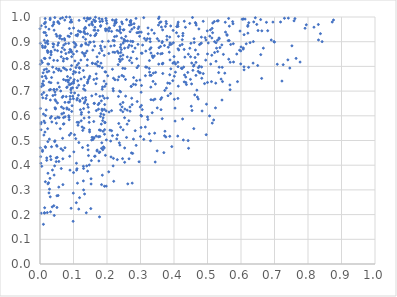
| Category | Series 0 |
|---|---|
| 0.10026556874731984 | 0.955 |
| 0.1819517743575303 | 0.609 |
| 0.1771262258294951 | 0.543 |
| 0.09390472384689774 | 0.86 |
| 0.16819413947047313 | 0.621 |
| 0.13568587887254713 | 0.955 |
| 0.20646389349107408 | 0.956 |
| 0.24066927445548747 | 0.554 |
| 0.015350063579710693 | 0.994 |
| 0.08437810121484224 | 0.736 |
| 0.09265286069839018 | 0.933 |
| 0.19814666030538775 | 0.985 |
| 0.1728333258345255 | 0.801 |
| 0.05060962885397868 | 0.229 |
| 0.08146551670438285 | 0.831 |
| 0.31585741547664603 | 0.862 |
| 0.5141808002395327 | 0.57 |
| 0.13102281671250027 | 0.938 |
| 0.607249656115732 | 0.992 |
| 0.27245043924423096 | 0.72 |
| 0.4761787506499745 | 0.774 |
| 0.13205579944221146 | 0.995 |
| 0.09480927989038723 | 0.731 |
| 0.19284473497875354 | 0.544 |
| 0.03145826905657623 | 0.211 |
| 0.2684906771497301 | 0.636 |
| 0.0689478089544322 | 0.679 |
| 0.11557802902882763 | 0.573 |
| 0.058682614736407346 | 0.914 |
| 0.0326091016070601 | 0.734 |
| 0.5750534551063965 | 0.981 |
| 0.1812025637016521 | 0.965 |
| 0.37188098921376656 | 0.519 |
| 0.13011481149460147 | 0.3 |
| 0.09579205669434854 | 0.641 |
| 0.5630582075837851 | 0.994 |
| 0.14620104510435572 | 0.992 |
| 6.409337085722111e-05 | 0.952 |
| 0.34501975401663887 | 0.776 |
| 0.5895707883860501 | 0.738 |
| 0.2841366990871361 | 0.54 |
| 0.1932207194245642 | 0.645 |
| 0.49557039403925884 | 0.907 |
| 0.18203469431865327 | 0.813 |
| 0.29907158180951077 | 0.635 |
| 0.014689962870337192 | 0.974 |
| 0.01535874526490244 | 0.832 |
| 0.1416819617440359 | 0.996 |
| 0.3027980588597663 | 0.642 |
| 0.4000415185988617 | 0.84 |
| 0.1638745704379666 | 0.946 |
| 0.21792696517527554 | 0.858 |
| 0.4494439416527911 | 0.839 |
| 0.3231766760107959 | 0.932 |
| 0.12060226647865258 | 0.625 |
| 0.027974936177323828 | 0.506 |
| 0.4314428765722057 | 0.765 |
| 0.20520382773491652 | 0.944 |
| 0.08138927686604114 | 0.744 |
| 0.046264569549891665 | 0.629 |
| 0.1765838042286566 | 0.994 |
| 0.01572348346076824 | 0.881 |
| 0.1961381049480757 | 0.945 |
| 0.4757139089389447 | 0.801 |
| 0.47430758918889815 | 0.952 |
| 0.4837980612194973 | 0.619 |
| 0.0026400657989910092 | 0.567 |
| 0.6797208627374799 | 0.945 |
| 0.5447931910867474 | 0.739 |
| 0.22728178959850187 | 0.989 |
| 0.6226952449082305 | 0.796 |
| 0.290195240685844 | 0.658 |
| 0.050525854703393436 | 0.922 |
| 0.5088011995242288 | 0.948 |
| 0.529937931306942 | 0.906 |
| 0.6427790357765258 | 0.997 |
| 0.25076080657347033 | 0.903 |
| 0.3025956680277393 | 0.854 |
| 0.6206462300745111 | 0.935 |
| 0.13402399781159857 | 0.656 |
| 0.028405896199059533 | 0.303 |
| 0.18062035601702253 | 0.883 |
| 0.15087369128088557 | 0.925 |
| 0.525501412248981 | 0.821 |
| 0.04834173558590216 | 0.43 |
| 0.02363641802173022 | 0.324 |
| 0.32195987168261453 | 0.585 |
| 0.2972922508358854 | 0.922 |
| 0.34970245159382785 | 0.458 |
| 0.27313207275730034 | 0.97 |
| 0.11806937995396949 | 0.268 |
| 0.3032494422821824 | 0.599 |
| 0.06963267569592202 | 0.822 |
| 0.6232424346209404 | 0.977 |
| 0.011935296388305039 | 0.579 |
| 0.061790431292910175 | 0.7 |
| 0.30112448925025115 | 0.602 |
| 0.16078771010480375 | 0.747 |
| 0.39744304814601106 | 0.946 |
| 0.5777168464549666 | 0.818 |
| 0.09294808445555347 | 0.988 |
| 0.1857196758212537 | 0.707 |
| 0.6470615556043265 | 0.97 |
| 0.05630012212312174 | 0.415 |
| 0.5118689039386773 | 0.738 |
| 0.46570169630899616 | 0.816 |
| 0.09090278505324034 | 0.788 |
| 0.24771757181139464 | 0.654 |
| 0.4527575087007224 | 0.814 |
| 0.05721925283836182 | 0.592 |
| 0.21934226022339232 | 0.752 |
| 0.6621734675893267 | 0.944 |
| 0.21368206760084119 | 0.942 |
| 0.25256290688585736 | 0.874 |
| 0.026783047678916705 | 0.951 |
| 0.7222401149916392 | 0.741 |
| 0.28075889666424114 | 0.973 |
| 0.33844782966370923 | 0.664 |
| 0.10392139179354021 | 0.878 |
| 0.4289293820875515 | 0.797 |
| 0.05230524627519173 | 0.864 |
| 0.09996996792522272 | 0.739 |
| 0.2559468799506681 | 0.922 |
| 0.16527526789529368 | 0.983 |
| 0.3263272542150569 | 0.528 |
| 0.2041702188227953 | 0.902 |
| 0.0507978492324479 | 0.477 |
| 0.5022482805342792 | 0.895 |
| 0.28706572583440726 | 0.48 |
| 0.3873801746113543 | 0.517 |
| 0.2663928652031412 | 0.886 |
| 0.661622896695709 | 0.751 |
| 0.010205455347492842 | 0.161 |
| 0.07030479660082845 | 0.747 |
| 0.23336439731173997 | 0.807 |
| 0.09272186306708186 | 0.982 |
| 0.10049003727784211 | 0.732 |
| 0.4790044537882422 | 0.892 |
| 0.28543485180994976 | 0.726 |
| 0.07832382068665056 | 0.678 |
| 0.10207341336619036 | 0.746 |
| 0.19215394253312934 | 0.626 |
| 0.42638629053642363 | 0.924 |
| 0.3548192222549754 | 0.904 |
| 0.09463059476489477 | 0.839 |
| 0.3349152714985585 | 0.612 |
| 0.3374752089544185 | 0.739 |
| 0.3384285799936705 | 0.773 |
| 0.10673999795277944 | 0.507 |
| 0.4125450617346582 | 0.979 |
| 0.5584927640739896 | 0.926 |
| 0.7296597914485607 | 0.995 |
| 0.6089242858925805 | 0.798 |
| 0.14045152138158867 | 0.862 |
| 0.6067408262787598 | 0.87 |
| 0.21360305617156394 | 0.621 |
| 0.06729628260377996 | 0.997 |
| 0.1786051730309648 | 0.679 |
| 0.6201764976616749 | 0.962 |
| 0.12134941940192745 | 0.94 |
| 0.1156605837023541 | 0.222 |
| 0.4371444842653355 | 0.726 |
| 0.041335983334457316 | 0.236 |
| 0.07457308683811725 | 0.654 |
| 0.0010905449936980949 | 0.893 |
| 0.4491313030098565 | 0.747 |
| 0.35001248794377404 | 0.632 |
| 0.1415229263325679 | 0.732 |
| 0.24074856537766642 | 0.623 |
| 0.5152808632112897 | 0.936 |
| 0.1638888438110856 | 0.958 |
| 0.4600235423387037 | 0.912 |
| 0.15461581681760728 | 0.681 |
| 0.12427719698328255 | 0.887 |
| 0.5957575849191697 | 0.866 |
| 0.2496666833154575 | 0.759 |
| 0.2089294490249608 | 0.542 |
| 0.3648366425011349 | 0.588 |
| 0.21091629650734067 | 0.498 |
| 0.044230331052747096 | 0.998 |
| 0.20770131290302307 | 0.954 |
| 0.05776216552282676 | 0.716 |
| 0.0281160524121421 | 0.704 |
| 0.06369094943995224 | 0.858 |
| 0.08706075912773859 | 0.584 |
| 0.0256980213396949 | 0.329 |
| 0.3881559062207369 | 0.826 |
| 0.006911389719848504 | 0.816 |
| 0.2766580065197035 | 0.448 |
| 0.08878684861618269 | 0.999 |
| 0.01601963362349057 | 0.333 |
| 0.3828430549997136 | 0.877 |
| 0.12906488099740143 | 0.919 |
| 0.37243811150176453 | 0.703 |
| 0.523831074597965 | 0.632 |
| 0.2311463020378831 | 0.522 |
| 0.16766662326689152 | 0.77 |
| 0.1347222853658233 | 0.704 |
| 0.07064562896821935 | 0.611 |
| 0.28872818774900155 | 0.831 |
| 0.11041341680096539 | 0.386 |
| 0.22451048598313272 | 0.981 |
| 0.012808798477404792 | 0.833 |
| 0.6585619603932726 | 0.99 |
| 0.4267459063185237 | 0.934 |
| 0.08644853887426607 | 0.857 |
| 0.02255690195745297 | 0.903 |
| 0.013933089729192605 | 0.228 |
| 0.18371177561457197 | 0.468 |
| 0.1635604016422022 | 0.924 |
| 0.05312627523438218 | 0.886 |
| 0.10729004170844492 | 0.795 |
| 0.0893396059844942 | 0.868 |
| 0.18847651014459477 | 0.592 |
| 0.11341998619497506 | 0.562 |
| 0.14282642441703552 | 0.48 |
| 0.17361154380483812 | 0.645 |
| 0.6271243233045264 | 0.896 |
| 0.19520417378286947 | 0.952 |
| 0.20518963799470902 | 0.373 |
| 0.4304789870395669 | 0.737 |
| 0.4999624870271625 | 0.85 |
| 0.3632060848736455 | 0.673 |
| 0.5578901570495735 | 0.929 |
| 0.6091595764979715 | 0.786 |
| 0.13950041197395335 | 0.397 |
| 0.24587155516521053 | 0.83 |
| 0.3873502810458115 | 0.919 |
| 0.5677325482540772 | 0.817 |
| 0.28929314846920295 | 0.936 |
| 0.3775293274903747 | 0.973 |
| 0.10877075779709156 | 0.408 |
| 0.11085850025772104 | 0.574 |
| 0.3552846711124541 | 0.876 |
| 0.08792464031030767 | 0.656 |
| 0.05417419624942865 | 0.277 |
| 0.49117990856359295 | 0.73 |
| 0.06045796507382517 | 0.548 |
| 0.16546098728261016 | 0.999 |
| 0.18937452700982738 | 0.474 |
| 0.4817669379369758 | 0.894 |
| 0.0030415355560901025 | 0.543 |
| 0.3205714733555646 | 0.912 |
| 0.40320620665382223 | 0.579 |
| 0.41419460996255697 | 0.866 |
| 0.0568124561529173 | 0.79 |
| 0.2739041135364201 | 0.883 |
| 0.3144355738101332 | 0.554 |
| 0.16699765742320927 | 0.687 |
| 0.1407786772447679 | 0.804 |
| 0.4244312361083943 | 0.889 |
| 0.24586819342463329 | 0.973 |
| 0.17715818919875526 | 0.853 |
| 0.020024968884303274 | 0.43 |
| 0.05022348571667945 | 0.707 |
| 0.11911961423895612 | 0.658 |
| 0.15550677330164198 | 0.513 |
| 0.8760285445301988 | 0.988 |
| 0.08677636847087322 | 0.625 |
| 0.04898208306755891 | 0.57 |
| 0.32919747569699487 | 0.9 |
| 0.011270269105640218 | 0.694 |
| 0.430351267950267 | 0.869 |
| 0.5674644719581031 | 0.706 |
| 0.031539858165400614 | 0.707 |
| 0.6368359996547834 | 0.9 |
| 0.07932324427630366 | 0.786 |
| 0.3016598181804785 | 0.553 |
| 0.07728244048470534 | 0.852 |
| 0.02119911983090339 | 0.777 |
| 0.22859007836038947 | 0.922 |
| 0.3422933845242234 | 0.53 |
| 0.597123470158712 | 0.943 |
| 0.41164776417916316 | 0.67 |
| 0.4599835990900918 | 0.806 |
| 0.07498233480556238 | 0.596 |
| 0.24043880692611552 | 0.841 |
| 0.3261755597148862 | 0.792 |
| 0.31872790273285867 | 0.797 |
| 0.031194139379450703 | 0.435 |
| 0.3880297455714433 | 0.895 |
| 0.3714815866897311 | 0.885 |
| 0.09093082733129654 | 0.728 |
| 0.11672121599017438 | 0.986 |
| 0.06545400941026491 | 0.91 |
| 0.11460371003813241 | 0.683 |
| 0.16794064615978355 | 0.933 |
| 0.23426854064865532 | 0.678 |
| 0.06836639866201366 | 0.46 |
| 0.2657998654338719 | 0.426 |
| 0.04754513193280607 | 0.659 |
| 0.292474212310208 | 0.937 |
| 0.17325080123220804 | 0.946 |
| 0.16328725709011604 | 0.882 |
| 0.2533458427211954 | 0.627 |
| 0.09203194989920005 | 0.705 |
| 0.7610190131869656 | 0.994 |
| 0.26015244175007557 | 0.566 |
| 0.46548607563532096 | 0.764 |
| 0.14859013473089977 | 0.76 |
| 0.10840537643241077 | 0.248 |
| 0.12195217345697362 | 0.826 |
| 0.3312097103470423 | 0.854 |
| 0.034034378509233854 | 0.597 |
| 0.4828982078259286 | 0.752 |
| 0.02012501586576676 | 0.682 |
| 0.04215014274249995 | 0.36 |
| 0.023308686726032923 | 0.81 |
| 0.378925228123725 | 0.908 |
| 0.6122396964687697 | 0.992 |
| 0.534892246616424 | 0.797 |
| 0.39676424604525795 | 0.813 |
| 0.1860477073653859 | 0.36 |
| 0.7949628396892549 | 0.968 |
| 0.46376351693969387 | 0.977 |
| 0.023415272604388138 | 0.86 |
| 0.027370838757366123 | 0.736 |
| 0.6091954729078424 | 0.928 |
| 0.5067814859339951 | 0.922 |
| 0.13627539676257094 | 0.894 |
| 0.2437827787196537 | 0.98 |
| 0.1613218143273636 | 0.512 |
| 0.17029328582759595 | 0.839 |
| 0.16796767511486843 | 0.809 |
| 0.016280873026682352 | 0.979 |
| 0.46980262857577837 | 0.676 |
| 0.2183046427853852 | 0.397 |
| 0.5156377471327153 | 0.976 |
| 0.025959312044622873 | 0.809 |
| 0.4824441360513452 | 0.798 |
| 0.23849595432338133 | 0.82 |
| 0.275222126585829 | 0.327 |
| 0.24716600290378987 | 0.792 |
| 0.1153533745693277 | 0.813 |
| 0.5061577487069316 | 0.599 |
| 0.04107315503140718 | 0.979 |
| 0.009412833938805876 | 0.774 |
| 0.11482415890608366 | 0.944 |
| 0.007270167645064829 | 0.456 |
| 0.22339633826894167 | 0.857 |
| 0.043741366710698504 | 0.397 |
| 0.12939712432935668 | 0.784 |
| 0.27054531786597913 | 0.968 |
| 0.2020937545442788 | 0.762 |
| 0.14146251784406072 | 0.827 |
| 0.26026615153705923 | 0.623 |
| 0.023729193913475166 | 0.367 |
| 0.21621816160642937 | 0.788 |
| 0.5619208702581954 | 0.904 |
| 0.4662586369830777 | 0.967 |
| 0.2950093455087558 | 0.96 |
| 0.0035264012572020498 | 0.573 |
| 0.18638284192433052 | 0.983 |
| 0.0035811418812498053 | 0.823 |
| 0.13108278773966264 | 0.55 |
| 0.19386972075756503 | 0.572 |
| 0.24854332373316623 | 0.895 |
| 0.36968558403490426 | 0.451 |
| 0.35390691611773506 | 0.994 |
| 0.27897933461218016 | 0.506 |
| 0.10986347183878031 | 0.861 |
| 0.49304196343418405 | 0.916 |
| 0.16082488826527086 | 0.947 |
| 0.18034866884573408 | 0.598 |
| 0.4246850538663174 | 0.908 |
| 0.09407611302103813 | 0.803 |
| 0.25575296910002543 | 0.903 |
| 0.14693969827887776 | 0.753 |
| 0.28817933058779466 | 0.742 |
| 0.2399257697050422 | 0.647 |
| 0.18305477179427898 | 0.566 |
| 0.06252711045066772 | 0.782 |
| 0.08954656757698831 | 0.679 |
| 0.4009469408255073 | 0.76 |
| 0.45812912118749727 | 0.801 |
| 0.016048391040615173 | 0.76 |
| 0.06507102216887817 | 0.608 |
| 0.099676768469102 | 0.669 |
| 0.14712091990569132 | 0.401 |
| 0.1188319147381467 | 0.663 |
| 0.19778492407058956 | 0.315 |
| 0.0993918521135313 | 0.287 |
| 0.012978747638058508 | 0.906 |
| 0.1604068485365655 | 0.509 |
| 0.24721373247150136 | 0.617 |
| 0.01921354923775942 | 0.789 |
| 0.05614355760995782 | 0.311 |
| 0.3906185734251949 | 0.79 |
| 0.4218432970489224 | 0.793 |
| 0.36438237536833473 | 0.896 |
| 0.3730216384846994 | 0.538 |
| 0.023464811512886485 | 0.891 |
| 0.12567851753082537 | 0.555 |
| 0.16301189138888805 | 0.436 |
| 0.06089074833945929 | 0.993 |
| 0.41785325854690025 | 0.884 |
| 0.4782589621081954 | 0.774 |
| 0.020035944868676214 | 0.42 |
| 0.010067930172069639 | 0.74 |
| 0.0707618434003292 | 0.886 |
| 0.20536002962425126 | 0.852 |
| 0.10345077315252327 | 0.692 |
| 0.2538105295578482 | 0.791 |
| 0.23238778014861794 | 0.745 |
| 0.38715617106426303 | 0.731 |
| 0.14555861377610257 | 0.615 |
| 0.04838082473988836 | 0.414 |
| 0.5371579989107619 | 0.876 |
| 0.26962356793745235 | 0.981 |
| 0.3651314861731152 | 0.811 |
| 0.8421649863162018 | 0.9 |
| 0.1776005657006665 | 0.191 |
| 0.4046901067052121 | 0.81 |
| 0.4721532625453232 | 0.78 |
| 0.5668328339198996 | 0.725 |
| 0.521175060964742 | 0.9 |
| 0.2925093555635978 | 0.889 |
| 0.29356887576301494 | 0.802 |
| 0.08470456476188559 | 0.655 |
| 0.04198637840318975 | 0.707 |
| 0.48177353209477325 | 0.918 |
| 0.4241494761443142 | 0.791 |
| 0.3147246403521389 | 0.762 |
| 0.5432484676659158 | 0.664 |
| 0.376330494205361 | 0.982 |
| 0.01705262539424801 | 0.96 |
| 0.29288861920097864 | 0.953 |
| 0.5770583398439529 | 0.892 |
| 0.44116864340162576 | 0.776 |
| 0.06749304808272472 | 0.509 |
| 0.25064013793441275 | 0.948 |
| 0.026452558310459784 | 0.781 |
| 0.09970183224468643 | 0.85 |
| 0.24460200044041813 | 0.763 |
| 0.7259454050895129 | 0.807 |
| 0.1075741870346939 | 0.926 |
| 0.18605007561443 | 0.901 |
| 0.01293529199674226 | 0.973 |
| 0.041092100223908634 | 0.889 |
| 0.22333864919745927 | 0.975 |
| 0.13013296418302966 | 0.629 |
| 0.12727556812547847 | 0.671 |
| 0.038819715660918463 | 0.892 |
| 0.10085686341441702 | 0.78 |
| 0.135728637045205 | 0.674 |
| 0.24090395420287092 | 0.936 |
| 0.4525269761614247 | 0.729 |
| 0.006310320671956471 | 0.759 |
| 0.09335044901748457 | 0.712 |
| 0.32085462363766626 | 0.595 |
| 0.565200726870183 | 0.963 |
| 0.280986706889082 | 0.957 |
| 0.26885507858076196 | 0.94 |
| 0.07390169328794571 | 0.987 |
| 0.40429170449972585 | 0.777 |
| 0.2386203072487295 | 0.481 |
| 0.08954600511305955 | 0.38 |
| 0.22390285915663366 | 0.985 |
| 0.1104475839500001 | 0.714 |
| 0.08563469965018211 | 0.893 |
| 0.2434622201952782 | 0.915 |
| 0.1425180829770173 | 0.738 |
| 0.4435076099198124 | 0.468 |
| 0.07150294937358204 | 0.568 |
| 0.04384150313211965 | 0.495 |
| 0.1105999477988211 | 0.805 |
| 0.12694143923948198 | 0.471 |
| 0.09286125841610282 | 0.226 |
| 0.14375808770706566 | 0.635 |
| 0.30186959360438603 | 0.695 |
| 0.02683878076680213 | 0.288 |
| 0.4133582968946744 | 0.922 |
| 0.1533170509346773 | 0.419 |
| 0.36570079023413493 | 0.811 |
| 0.22253070175604095 | 0.92 |
| 0.27063699943594177 | 0.902 |
| 0.19999666255924642 | 0.95 |
| 0.5270371642014625 | 0.874 |
| 0.1118484963204065 | 0.327 |
| 0.19960706253088079 | 0.974 |
| 0.06819055482610181 | 0.426 |
| 0.1382211315178823 | 0.207 |
| 0.05519035917144022 | 0.784 |
| 0.045090425104520326 | 0.665 |
| 0.1224382066455566 | 0.749 |
| 0.21378012501778698 | 0.54 |
| 0.012537372460865948 | 0.786 |
| 0.005225285065699747 | 0.396 |
| 0.08592183489505179 | 0.6 |
| 0.3570828154488721 | 0.977 |
| 0.5350434407235144 | 0.912 |
| 0.48722348998336207 | 0.983 |
| 0.29682175872761407 | 0.939 |
| 0.3981750726535357 | 0.896 |
| 0.5292053994048727 | 0.984 |
| 0.4563923560698353 | 0.784 |
| 0.36524957537127856 | 0.901 |
| 0.3284227518933137 | 0.764 |
| 0.09765074491569858 | 0.679 |
| 0.41130216938175235 | 0.971 |
| 0.10616959785194358 | 0.776 |
| 0.19362556746437354 | 0.879 |
| 0.6070246135942582 | 0.875 |
| 0.0513529873752695 | 0.432 |
| 0.5761697556395453 | 0.972 |
| 0.22186762255208026 | 0.904 |
| 0.030940856529117045 | 0.591 |
| 0.010649954598474176 | 0.724 |
| 0.29842934621027595 | 0.745 |
| 0.33365774557552064 | 0.947 |
| 0.3873012847239292 | 0.766 |
| 0.21629212575211731 | 0.988 |
| 0.6379806610566899 | 0.98 |
| 0.11261159950356725 | 0.93 |
| 0.04493657248845684 | 0.633 |
| 0.23701717915236264 | 0.829 |
| 0.10423868789613511 | 0.822 |
| 0.26058382047463047 | 0.838 |
| 0.4030485600776271 | 0.631 |
| 0.4075917027402344 | 0.936 |
| 0.24643500134346175 | 0.427 |
| 0.013429398316909036 | 0.206 |
| 0.1616547014283548 | 0.65 |
| 0.0505358214095557 | 0.276 |
| 0.10013734232593308 | 0.37 |
| 0.49468587386979945 | 0.825 |
| 0.5320002848235901 | 0.985 |
| 0.13008596267470407 | 0.387 |
| 0.030952588947074977 | 0.664 |
| 0.5203412545049095 | 0.982 |
| 0.44698870633271115 | 0.974 |
| 0.05716994089308869 | 0.974 |
| 0.5096133895364682 | 0.809 |
| 0.000979609696112993 | 0.47 |
| 0.0034110831117901697 | 0.206 |
| 0.44721645826572165 | 0.873 |
| 0.32665862092278464 | 0.824 |
| 0.03307998234788334 | 0.847 |
| 0.0023967276710264995 | 0.408 |
| 0.4629109108692524 | 0.836 |
| 0.12323034908050967 | 0.606 |
| 0.362423584432221 | 0.959 |
| 0.04213448050168844 | 0.947 |
| 0.4112242804865971 | 0.518 |
| 0.27618353993542666 | 0.9 |
| 0.39340802808861575 | 0.475 |
| 0.08362007431778196 | 0.923 |
| 0.649754854536355 | 0.804 |
| 0.40112094346012606 | 0.667 |
| 0.11993964487045328 | 0.94 |
| 0.4651724061184306 | 0.974 |
| 0.27145305867420755 | 0.834 |
| 0.001323726083991783 | 0.63 |
| 0.013141341247565386 | 0.207 |
| 0.2723032868738716 | 0.718 |
| 0.18321245343436487 | 0.66 |
| 0.13805608978270312 | 0.984 |
| 0.018017832784651633 | 0.67 |
| 0.24865083493549578 | 0.948 |
| 0.08031864275230838 | 0.628 |
| 0.07955318231550612 | 0.832 |
| 0.18500239697108034 | 0.627 |
| 0.3773556252722092 | 0.712 |
| 0.045199690984254026 | 0.685 |
| 0.04582881353383039 | 0.628 |
| 0.04899261560537649 | 0.791 |
| 0.230738205684339 | 0.422 |
| 0.2524942239969409 | 0.592 |
| 0.02932142050050246 | 0.834 |
| 0.5406012301723095 | 0.749 |
| 0.21818216286259962 | 0.905 |
| 0.24817535298108373 | 0.543 |
| 0.3115551436152355 | 0.913 |
| 0.18667104027803005 | 0.717 |
| 0.6759419058768288 | 0.978 |
| 0.2794234940833916 | 0.755 |
| 0.034603059400479474 | 0.755 |
| 0.022836215938571103 | 0.548 |
| 0.11857881217497768 | 0.793 |
| 0.052136628704503196 | 0.824 |
| 0.3859142243636581 | 0.858 |
| 0.569107866006032 | 0.889 |
| 0.23675085730685042 | 0.491 |
| 0.014774773408096853 | 0.534 |
| 0.19177321998913088 | 0.845 |
| 0.4760914079104668 | 0.888 |
| 0.2702512277592698 | 0.983 |
| 0.0909066962373769 | 0.753 |
| 0.1542135567838191 | 0.502 |
| 0.5184702264249323 | 0.583 |
| 0.7763451546174773 | 0.818 |
| 0.8722734688921077 | 0.98 |
| 0.38732450765044835 | 0.887 |
| 0.14448965762335353 | 0.887 |
| 0.17451333552779347 | 0.515 |
| 0.26292857656692636 | 0.877 |
| 0.04451596487974929 | 0.867 |
| 0.6001838911262247 | 0.879 |
| 0.07392420827966284 | 0.791 |
| 0.2218827019783739 | 0.884 |
| 0.18056800982750665 | 0.962 |
| 0.09282814374633364 | 0.694 |
| 0.27014128053093245 | 0.978 |
| 0.008285996249996708 | 0.673 |
| 0.0481733032368411 | 0.93 |
| 0.0704874208942583 | 0.831 |
| 0.7083243967436292 | 0.809 |
| 0.6038116134363859 | 0.991 |
| 0.09054039349331477 | 0.667 |
| 0.1918088081601036 | 0.47 |
| 0.05209654258037677 | 0.652 |
| 0.3812288550108014 | 0.733 |
| 0.053696092600752254 | 0.981 |
| 0.4515503947693691 | 0.639 |
| 0.09736877722055559 | 0.713 |
| 0.06688362828824046 | 0.875 |
| 0.7398877470632018 | 0.826 |
| 0.42568027999469693 | 0.587 |
| 0.1295228789071915 | 0.396 |
| 0.36697006353334294 | 0.813 |
| 0.15433854928379864 | 0.973 |
| 0.23769854297559656 | 0.7 |
| 0.3051805824521445 | 0.625 |
| 0.00825385440720594 | 0.877 |
| 0.1964323172656447 | 0.777 |
| 0.17654036770803905 | 0.451 |
| 0.04961041660790255 | 0.48 |
| 0.27495894702482093 | 0.645 |
| 0.37435576538276505 | 0.962 |
| 0.18064095902340427 | 0.541 |
| 0.06345724624097082 | 0.839 |
| 0.18496316451046046 | 0.864 |
| 0.0939214732069873 | 0.858 |
| 0.3512000780179566 | 0.852 |
| 0.3544058638096226 | 0.809 |
| 0.28959804875175155 | 0.795 |
| 0.13592627004894575 | 0.854 |
| 0.5537845777375714 | 0.939 |
| 0.7911978827416207 | 0.954 |
| 0.5873267486388861 | 0.85 |
| 0.04097598389781498 | 0.825 |
| 0.0038406939968781417 | 0.964 |
| 0.019256713496697664 | 0.926 |
| 0.08784137858942187 | 0.92 |
| 0.6984837358790981 | 0.9 |
| 0.10080323676765501 | 0.897 |
| 0.07022938336196383 | 0.593 |
| 0.37883086547091616 | 0.922 |
| 0.7520149758842468 | 0.883 |
| 0.0702400315718763 | 0.63 |
| 0.27423119035429233 | 0.814 |
| 0.03293750223993974 | 0.856 |
| 0.04069926363084597 | 0.971 |
| 0.034448523626565586 | 0.475 |
| 0.18582064670566567 | 0.621 |
| 0.2405649849526984 | 0.697 |
| 0.2216975768940248 | 0.966 |
| 0.3757645860912503 | 0.514 |
| 0.41199084634404703 | 0.871 |
| 0.5428033962324387 | 0.887 |
| 0.021821356845561857 | 0.9 |
| 0.07700287276151174 | 0.743 |
| 0.060907758213628926 | 0.923 |
| 0.4717878214067712 | 0.849 |
| 0.023326585331763572 | 0.856 |
| 0.23662624947003497 | 0.944 |
| 0.0304641124244438 | 0.995 |
| 0.09035264589454872 | 0.979 |
| 0.3352076123714627 | 0.843 |
| 0.8309278862848936 | 0.97 |
| 0.13175000788950897 | 0.942 |
| 0.19527127367898234 | 0.44 |
| 0.17910483156795853 | 0.982 |
| 0.30475986488035445 | 0.853 |
| 0.07851648983648285 | 1 |
| 0.14365178158857606 | 0.462 |
| 0.2865666393994729 | 0.994 |
| 0.030093555178008824 | 0.989 |
| 0.16458383125927223 | 0.437 |
| 0.005485869578532698 | 0.686 |
| 0.33707724433813613 | 0.836 |
| 0.45512849849976544 | 0.998 |
| 0.5646929037336029 | 0.905 |
| 0.3313751310452647 | 0.876 |
| 0.2299622683425382 | 0.946 |
| 0.5333275973121983 | 0.775 |
| 0.16228616166117127 | 0.65 |
| 0.01596741471175589 | 0.937 |
| 0.06269866613484254 | 0.467 |
| 0.35980265079451257 | 0.881 |
| 0.2612958524547552 | 0.903 |
| 0.011745841752718644 | 0.938 |
| 0.4107944413111395 | 0.962 |
| 0.5633384355582435 | 0.829 |
| 0.045853778769243125 | 0.59 |
| 0.19668217296878676 | 0.994 |
| 0.25086690379248267 | 0.909 |
| 0.39009700572860706 | 0.964 |
| 0.36656015052653135 | 0.771 |
| 0.1937742139562808 | 0.573 |
| 0.19043287300614575 | 0.604 |
| 0.01851662368466911 | 0.624 |
| 0.14792182765867656 | 0.543 |
| 0.13225131114990307 | 0.756 |
| 0.7457117992759155 | 0.793 |
| 0.432528925559132 | 0.838 |
| 0.650853143796335 | 0.945 |
| 0.2415283229457722 | 0.888 |
| 0.1427615001681527 | 0.993 |
| 0.1330946325749207 | 0.283 |
| 0.24763572410984935 | 0.846 |
| 0.21918444911419255 | 0.428 |
| 0.19214183248780803 | 0.671 |
| 0.1351380841819142 | 0.932 |
| 0.2957136980521824 | 0.414 |
| 0.17577582784969115 | 0.417 |
| 0.0009765209398052699 | 0.809 |
| 0.18753473362812279 | 0.462 |
| 0.1787370302273461 | 0.453 |
| 0.010288093739639681 | 0.607 |
| 0.6589948118423543 | 0.848 |
| 0.2775820709479393 | 0.859 |
| 0.28380451057224454 | 0.874 |
| 0.11540763153380607 | 0.724 |
| 0.1421233048874303 | 0.376 |
| 0.43519714314852553 | 0.757 |
| 0.3821489344035579 | 0.681 |
| 0.21202598877710843 | 0.434 |
| 0.4999455195047119 | 0.735 |
| 0.534450554602416 | 0.915 |
| 0.07279301957764028 | 0.913 |
| 0.07340380650593514 | 0.867 |
| 0.22786273336055196 | 0.979 |
| 0.16039473986933628 | 0.577 |
| 0.18719174063556454 | 0.68 |
| 0.3896338919237542 | 0.69 |
| 0.14680094240035968 | 0.573 |
| 0.4128146740407179 | 0.72 |
| 0.20614960735271526 | 0.615 |
| 0.30967386180409506 | 0.997 |
| 0.3444570547820176 | 0.729 |
| 0.032882342222216976 | 0.861 |
| 0.09892426000838228 | 0.173 |
| 0.1502143867020369 | 0.898 |
| 0.2527164666696766 | 0.47 |
| 0.14650152986507892 | 0.593 |
| 0.1230116067169762 | 0.58 |
| 0.1376012438326878 | 0.89 |
| 0.1172556104021184 | 0.795 |
| 0.21814473817386448 | 0.71 |
| 0.11257585998770148 | 0.742 |
| 0.03533267584208899 | 0.575 |
| 0.21140191632240335 | 0.882 |
| 0.6903001900202067 | 0.907 |
| 0.14378727703117833 | 0.746 |
| 0.36131479912459175 | 0.625 |
| 0.04480551364329055 | 0.697 |
| 0.3601933596277139 | 0.667 |
| 0.15249487045321886 | 0.324 |
| 0.07627943439232376 | 0.892 |
| 0.5138431429860771 | 0.954 |
| 0.05280668106170594 | 0.595 |
| 0.551633203591172 | 0.773 |
| 0.45908583847915607 | 0.548 |
| 0.13614282120900223 | 0.91 |
| 0.016605088596364115 | 0.472 |
| 0.19736989296264063 | 0.729 |
| 0.01892072751366114 | 0.752 |
| 0.5302996492171322 | 0.86 |
| 0.09231717967459274 | 0.529 |
| 0.13334188360995147 | 0.842 |
| 0.8313485097272867 | 0.907 |
| 0.10999050775070462 | 0.664 |
| 0.14821509081311635 | 0.898 |
| 0.023401614533068882 | 0.495 |
| 0.11597799759869065 | 0.492 |
| 0.02172712857397885 | 0.208 |
| 0.06841271788292347 | 0.321 |
| 0.33132121961688643 | 0.665 |
| 0.29997469757920114 | 0.516 |
| 0.16935001233005986 | 0.751 |
| 0.5212192269938585 | 0.856 |
| 0.2736622059315996 | 0.671 |
| 0.1569579934217732 | 0.968 |
| 0.2789620358430588 | 0.728 |
| 0.03768286848634261 | 0.797 |
| 0.43415857767908883 | 0.958 |
| 0.21896818645207006 | 0.701 |
| 0.004181935779355439 | 0.718 |
| 0.1680780495036639 | 0.518 |
| 0.25561642296506637 | 0.68 |
| 0.4011155724049953 | 0.817 |
| 0.23117762417198617 | 0.861 |
| 0.271259218197314 | 0.986 |
| 0.17661696580695208 | 0.651 |
| 0.49607702929070907 | 0.523 |
| 0.16458236369215407 | 0.984 |
| 0.04461895854964615 | 0.499 |
| 0.524609599057808 | 0.732 |
| 0.05863738638789151 | 0.924 |
| 0.16556864121795023 | 0.927 |
| 0.04113915425060288 | 0.705 |
| 0.03942947552006093 | 0.879 |
| 0.19131648488538122 | 0.74 |
| 0.17769320497553376 | 0.8 |
| 0.05513142080192002 | 0.895 |
| 0.2690408777607457 | 0.618 |
| 0.47228566771613545 | 0.668 |
| 0.11149754037949111 | 0.924 |
| 0.27300028502261864 | 0.45 |
| 0.4683140990890874 | 0.704 |
| 0.5474200199928719 | 0.849 |
| 0.5128452219985012 | 0.845 |
| 0.13074971741905894 | 0.85 |
| 0.21625070692546844 | 0.52 |
| 0.1275614735682814 | 0.541 |
| 0.343214773115586 | 0.668 |
| 0.543938865202086 | 0.796 |
| 0.10932530965414089 | 0.38 |
| 0.43064482698790385 | 0.983 |
| 0.016418226056340912 | 0.601 |
| 0.12398612275917731 | 0.613 |
| 0.06641692429171153 | 0.675 |
| 0.34386534459503904 | 0.413 |
| 0.007491413495501753 | 0.461 |
| 0.1856682382026884 | 0.794 |
| 0.6360961672088375 | 0.813 |
| 0.06974299556185326 | 0.566 |
| 0.15778658511525945 | 0.866 |
| 0.2672442530110113 | 0.824 |
| 0.10305517622565608 | 0.523 |
| 0.08655407615942867 | 0.594 |
| 0.1578920969556613 | 0.503 |
| 0.15160980891126474 | 0.224 |
| 0.04254351677161927 | 0.197 |
| 0.3166199376618276 | 0.905 |
| 0.3021923568182999 | 0.939 |
| 0.3501258959554586 | 0.912 |
| 0.4727557710135768 | 0.795 |
| 0.1981904286566991 | 0.502 |
| 0.26206072865066155 | 0.324 |
| 0.23434771929428055 | 0.854 |
| 0.4992548195516954 | 0.944 |
| 0.1564645685644689 | 0.813 |
| 0.13172090950525384 | 0.591 |
| 0.007178067489782003 | 0.73 |
| 0.764482268664055 | 0.832 |
| 0.23937911695105285 | 0.95 |
| 0.03853467359246321 | 0.682 |
| 0.3410442861201022 | 0.842 |
| 0.33080778948739964 | 0.716 |
| 0.1745777607694179 | 0.627 |
| 0.07982881343748227 | 0.714 |
| 0.36103695472432584 | 0.98 |
| 0.3964063582463745 | 0.742 |
| 0.13514834145116716 | 0.958 |
| 0.4114395472366107 | 0.817 |
| 0.13665553195022562 | 0.664 |
| 0.32782083704867404 | 0.869 |
| 0.13196685926648422 | 0.722 |
| 0.14802223901825606 | 0.535 |
| 0.46392109952634764 | 0.866 |
| 0.016601921615037485 | 0.895 |
| 0.09909181486789898 | 0.77 |
| 0.12261633703163899 | 0.882 |
| 0.1785366371287238 | 0.516 |
| 0.24285232756664377 | 0.868 |
| 0.13209869818458364 | 0.651 |
| 0.06418159205118779 | 0.636 |
| 0.05339660339794228 | 0.979 |
| 0.1325760993195091 | 0.953 |
| 0.2771972081573709 | 0.901 |
| 0.2741259635779988 | 0.95 |
| 0.1941537454484371 | 0.778 |
| 0.07454671190519702 | 0.471 |
| 0.411922373534621 | 0.962 |
| 0.3153278389641909 | 0.797 |
| 0.6953554588818318 | 0.979 |
| 0.041255255022095705 | 0.776 |
| 0.03713628499954791 | 0.38 |
| 0.2398954093868264 | 0.823 |
| 0.09464074747243267 | 0.618 |
| 0.1603526895796097 | 0.989 |
| 0.3411044824931647 | 0.934 |
| 0.12948942513241357 | 0.336 |
| 0.0017641062471277502 | 0.435 |
| 0.1447804695913424 | 0.439 |
| 0.44216973338232046 | 0.5 |
| 0.08571679417175004 | 0.744 |
| 0.32702999436787383 | 0.777 |
| 0.30979642946505104 | 0.504 |
| 0.14693905176280775 | 0.968 |
| 0.4429405162581458 | 0.849 |
| 0.19264483910842556 | 0.525 |
| 0.1667425574509257 | 0.73 |
| 0.14204702783662904 | 0.646 |
| 0.19247060741700728 | 0.315 |
| 0.015793656084511665 | 0.475 |
| 0.30630364091123985 | 0.886 |
| 0.19735448271384526 | 0.62 |
| 0.08115236363343059 | 0.717 |
| 0.17004017392673665 | 0.458 |
| 0.08026791812963929 | 0.632 |
| 0.1500230650252471 | 0.995 |
| 0.030574369569414284 | 0.272 |
| 0.33202000003688936 | 0.764 |
| 0.8178460410747634 | 0.959 |
| 0.25513202888723485 | 0.747 |
| 0.48729208033046456 | 0.771 |
| 0.037420499423266085 | 0.964 |
| 0.08773934524264237 | 0.522 |
| 0.36488649563097186 | 0.853 |
| 0.4504525391928269 | 0.894 |
| 0.006945478665154381 | 0.883 |
| 0.1819651239077792 | 0.873 |
| 0.16492821066286334 | 0.811 |
| 0.36041925177985 | 0.851 |
| 0.17061191544479692 | 0.461 |
| 0.08725168341023726 | 0.726 |
| 0.053552023604933385 | 0.733 |
| 0.1882184700860995 | 0.537 |
| 0.2200545472472093 | 0.335 |
| 0.014497375436250404 | 0.572 |
| 0.11149550334277725 | 0.671 |
| 0.15527989155182575 | 0.98 |
| 0.1263772831716724 | 0.856 |
| 0.22559982155355351 | 0.974 |
| 0.23840645770643754 | 0.96 |
| 0.6998469418902526 | 0.898 |
| 0.02214452071189521 | 0.864 |
| 0.32811961952869406 | 0.912 |
| 0.4537138236182158 | 0.621 |
| 0.03641574974723638 | 0.231 |
| 0.26524434936080055 | 0.58 |
| 0.4081455151581932 | 0.961 |
| 0.4603295480975186 | 0.897 |
| 0.5991717596186842 | 0.81 |
| 0.18525994882382169 | 0.991 |
| 0.12996379334682973 | 0.709 |
| 0.06989872205552172 | 0.794 |
| 0.19357700794563193 | 0.719 |
| 0.615587072445288 | 0.891 |
| 0.2412829761574462 | 0.856 |
| 0.20135123630619922 | 0.672 |
| 0.011545800614539692 | 0.522 |
| 0.16074451637774745 | 0.9 |
| 0.4969467101209316 | 0.647 |
| 0.6205088754956758 | 0.967 |
| 0.3923734506263056 | 0.89 |
| 0.4618534404482173 | 0.685 |
| 0.718065258051932 | 0.98 |
| 0.5995334333087567 | 0.863 |
| 0.43522381813143707 | 0.735 |
| 0.06350313093027349 | 0.386 |
| 0.2585080439038704 | 0.989 |
| 0.26674155548736933 | 0.967 |
| 0.11726771820337523 | 0.775 |
| 0.1837087624537569 | 0.321 |
| 0.16440125517877102 | 0.982 |
| 0.014915321619239474 | 0.877 |
| 0.5530546291365277 | 0.979 |
| 0.35363735537946883 | 0.967 |
| 0.2527205179283374 | 0.412 |
| 0.07387444406067512 | 0.907 |
| 0.36601210722438626 | 0.948 |
| 0.09456369542143972 | 0.98 |
| 0.15232156826554621 | 0.345 |
| 0.17214884986723555 | 0.819 |
| 0.24494796131415575 | 0.636 |
| 0.2583698521773933 | 0.512 |
| 0.08211615351288326 | 0.759 |
| 0.22387037795351628 | 0.746 |
| 0.35558677177112163 | 1 |
| 0.41210243347515896 | 0.799 |
| 0.6667585937574387 | 0.874 |
| 0.7583403837606205 | 0.984 |
| 0.08777420787409929 | 0.953 |
| 0.2351814100137597 | 0.569 |
| 0.7413379590935969 | 0.995 |
| 0.09227286159717352 | 0.866 |
| 0.1844880074553602 | 0.491 |
| 0.4278908997240818 | 0.502 |
| 0.5256031792584132 | 0.896 |
| 0.15634922618119618 | 0.812 |
| 0.14176270125788204 | 0.932 |
| 0.24012339307843433 | 0.877 |
| 0.18714015645095694 | 0.581 |
| 0.23555319735925873 | 0.758 |
| 0.1078462487932843 | 0.886 |
| 0.5130726113521186 | 0.915 |
| 0.8371585017513995 | 0.933 |
| 0.10523464530219273 | 0.892 |
| 0.08862894188123804 | 0.436 |
| 0.3029197748626077 | 0.723 |
| 0.03281405187789754 | 0.423 |
| 0.10100360004236553 | 0.454 |
| 0.029772865957564787 | 0.347 |
| 0.32246469339381656 | 0.956 |
| 0.22910886026229482 | 0.506 |
| 0.3298968151385866 | 0.499 |